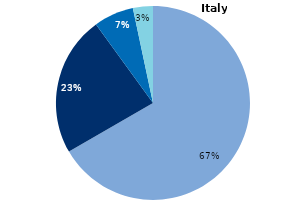
| Category | Series 0 |
|---|---|
| Personal fund/Loan | 0.667 |
| Venture capital/Business angel | 0.233 |
| Government fund/Grant | 0.067 |
| Initial Coin Offering/Security Token Offering | 0 |
| Other | 0.033 |